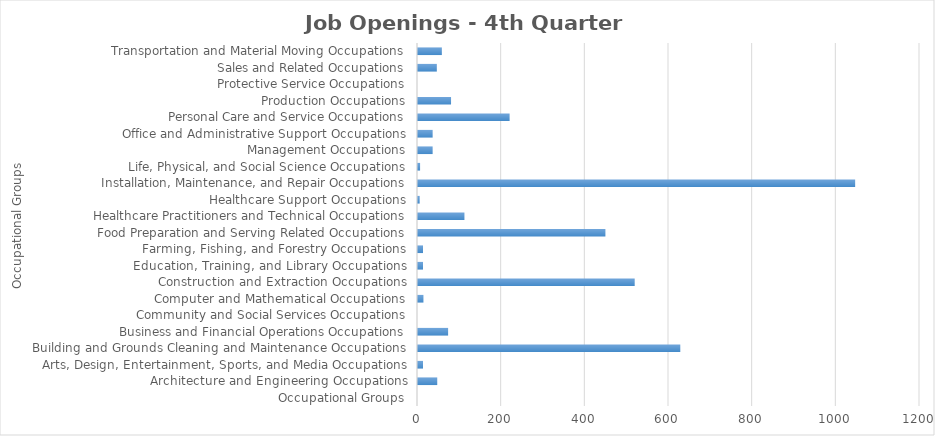
| Category | Series1 |
|---|---|
| Occupational Groups | 0 |
| Architecture and Engineering Occupations | 46 |
| Arts, Design, Entertainment, Sports, and Media Occupations | 12 |
| Building and Grounds Cleaning and Maintenance Occupations | 627 |
| Business and Financial Operations Occupations | 72 |
| Community and Social Services Occupations | 0 |
| Computer and Mathematical Occupations | 13 |
| Construction and Extraction Occupations | 518 |
| Education, Training, and Library Occupations | 12 |
| Farming, Fishing, and Forestry Occupations | 12 |
| Food Preparation and Serving Related Occupations | 448 |
| Healthcare Practitioners and Technical Occupations | 111 |
| Healthcare Support Occupations | 4 |
| Installation, Maintenance, and Repair Occupations | 1045 |
| Life, Physical, and Social Science Occupations | 5 |
| Management Occupations | 35 |
| Office and Administrative Support Occupations | 35 |
| Personal Care and Service Occupations | 219 |
| Production Occupations | 79 |
| Protective Service Occupations | 0 |
| Sales and Related Occupations | 45 |
| Transportation and Material Moving Occupations | 57 |